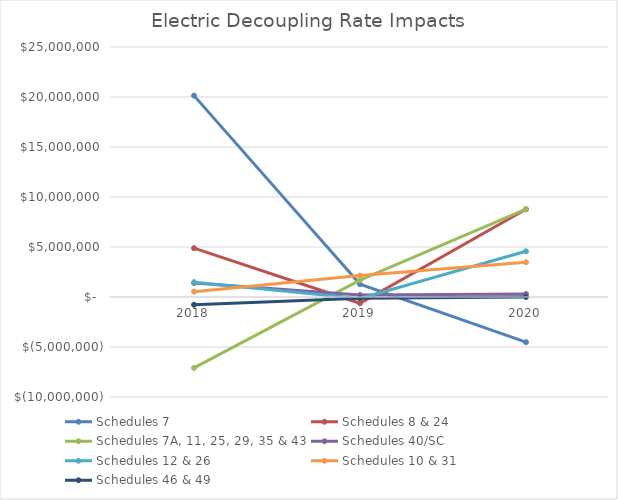
| Category | Schedules 7 | Schedules 8 & 24 | Schedules 7A, 11, 25, 29, 35 & 43 | Schedules 40/SC | Schedules 12 & 26 | Schedules 10 & 31 | Schedules 46 & 49 |
|---|---|---|---|---|---|---|---|
| 2018.0 | 20137000 | 4882000 | -7087000 | 1398000 | 1484000 | 531000 | -777000 |
| 2019.0 | 1284000 | -628000 | 1695000 | 201000 | -138000 | 2139000 | -115000 |
| 2020.0 | -4519000 | 8777000 | 8780000 | 302000 | 4570000 | 3478000 | 0 |